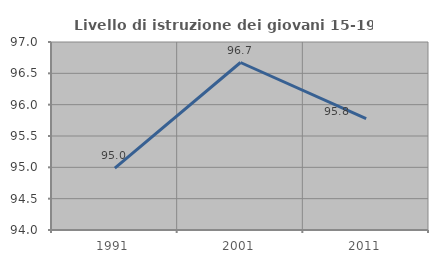
| Category | Livello di istruzione dei giovani 15-19 anni |
|---|---|
| 1991.0 | 94.988 |
| 2001.0 | 96.673 |
| 2011.0 | 95.777 |